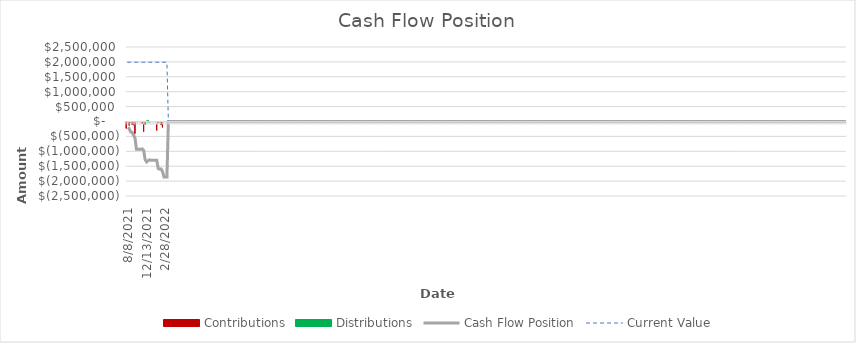
| Category | Contributions | Distributions |
|---|---|---|
| 8/8/21 | -212000 | 0 |
| 8/11/21 | -25000 | 0 |
| 8/18/21 | -113000 | 0 |
| 8/26/21 | -15000 | 0 |
| 9/1/21 | -84000 | 0 |
| 9/16/21 | -98000 | 0 |
| 9/28/21 | -386000 | 0 |
| 10/3/21 | 0 | 0 |
| 10/5/21 | 0 | 0 |
| 10/8/21 | 0 | 0 |
| 10/26/21 | 0 | 14000 |
| 11/19/21 | -48000 | 0 |
| 12/3/21 | -318000 | 0 |
| 12/13/21 | -73000 | 0 |
| 12/16/21 | 0 | 42000 |
| 12/24/21 | 0 | 31000 |
| 12/27/21 | -15000 | 0 |
| 1/5/22 | 0 | 0 |
| 1/5/22 | 0 | 0 |
| 1/7/22 | 0 | 0 |
| 1/8/22 | 0 | 0 |
| 1/18/22 | -279000 | 0 |
| 2/1/22 | -20000 | 0 |
| 2/4/22 | 0 | 8000 |
| 2/8/22 | -91000 | 0 |
| 2/21/22 | -177000 | 0 |
| 2/28/22 | 0 | 0 |
| 3/3/22 | 0 | 0 |